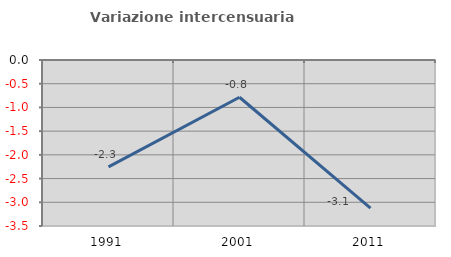
| Category | Variazione intercensuaria annua |
|---|---|
| 1991.0 | -2.253 |
| 2001.0 | -0.785 |
| 2011.0 | -3.122 |